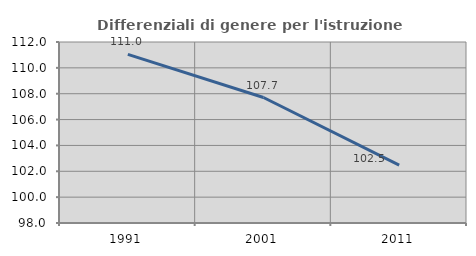
| Category | Differenziali di genere per l'istruzione superiore |
|---|---|
| 1991.0 | 111.045 |
| 2001.0 | 107.705 |
| 2011.0 | 102.48 |